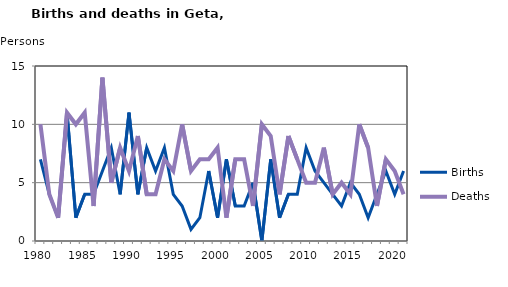
| Category | Births | Deaths |
|---|---|---|
| 1980.0 | 7 | 10 |
| 1981.0 | 4 | 4 |
| 1982.0 | 2 | 2 |
| 1983.0 | 11 | 11 |
| 1984.0 | 2 | 10 |
| 1985.0 | 4 | 11 |
| 1986.0 | 4 | 3 |
| 1987.0 | 6 | 14 |
| 1988.0 | 8 | 5 |
| 1989.0 | 4 | 8 |
| 1990.0 | 11 | 6 |
| 1991.0 | 4 | 9 |
| 1992.0 | 8 | 4 |
| 1993.0 | 6 | 4 |
| 1994.0 | 8 | 7 |
| 1995.0 | 4 | 6 |
| 1996.0 | 3 | 10 |
| 1997.0 | 1 | 6 |
| 1998.0 | 2 | 7 |
| 1999.0 | 6 | 7 |
| 2000.0 | 2 | 8 |
| 2001.0 | 7 | 2 |
| 2002.0 | 3 | 7 |
| 2003.0 | 3 | 7 |
| 2004.0 | 5 | 3 |
| 2005.0 | 0 | 10 |
| 2006.0 | 7 | 9 |
| 2007.0 | 2 | 4 |
| 2008.0 | 4 | 9 |
| 2009.0 | 4 | 7 |
| 2010.0 | 8 | 5 |
| 2011.0 | 6 | 5 |
| 2012.0 | 5 | 8 |
| 2013.0 | 4 | 4 |
| 2014.0 | 3 | 5 |
| 2015.0 | 5 | 4 |
| 2016.0 | 4 | 10 |
| 2017.0 | 2 | 8 |
| 2018.0 | 4 | 3 |
| 2019.0 | 6 | 7 |
| 2020.0 | 4 | 6 |
| 2021.0 | 6 | 4 |